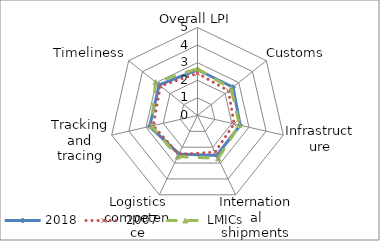
| Category | 2018 | 2007 | LMICs |
|---|---|---|---|
| Overall LPI | 2.598 | 2.4 | 2.659 |
| Customs | 2.582 | 2.25 | 2.445 |
| Infrastructure | 2.489 | 2.133 | 2.446 |
| International shipments | 2.515 | 2.308 | 2.704 |
| Logistics competence | 2.424 | 2.455 | 2.591 |
| Tracking and tracing | 2.787 | 2.583 | 2.686 |
| Timeliness | 2.787 | 2.692 | 3.047 |